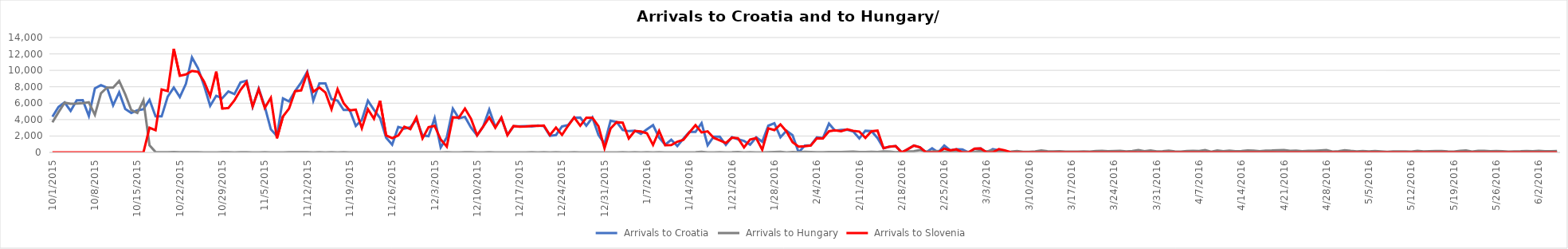
| Category | Arrivals to Croatia | Arrivals to Hungary | Arrivals to Slovenia |
|---|---|---|---|
| 10/1/15 | 4344 | 3667 | 0 |
| 10/2/15 | 5546 | 4897 | 0 |
| 10/3/15 | 6086 | 6056 | 0 |
| 10/4/15 | 5065 | 5925 | 0 |
| 10/5/15 | 6338 | 5952 | 0 |
| 10/6/15 | 6370 | 6000 | 0 |
| 10/7/15 | 4446 | 6103 | 0 |
| 10/8/15 | 7798 | 4583 | 6 |
| 10/9/15 | 8201 | 7215 | 0 |
| 10/10/15 | 7896 | 7907 | 0 |
| 10/11/15 | 5732 | 7897 | 0 |
| 10/12/15 | 7317 | 8702 | 0 |
| 10/13/15 | 5286 | 7081 | 0 |
| 10/14/15 | 4814 | 5157 | 0 |
| 10/15/15 | 5138 | 4808 | 0 |
| 10/16/15 | 5260 | 6353 | 0 |
| 10/17/15 | 6415 | 870 | 3000 |
| 10/18/15 | 4390 | 41 | 2700 |
| 10/19/15 | 4388 | 22 | 7677 |
| 10/20/15 | 6793 | 36 | 7478 |
| 10/21/15 | 7900 | 39 | 12616 |
| 10/22/15 | 6748 | 32 | 9339 |
| 10/23/15 | 8348 | 29 | 9500 |
| 10/24/15 | 11570 | 35 | 9925 |
| 10/25/15 | 10249 | 34 | 9818 |
| 10/26/15 | 8128 | 12 | 8625 |
| 10/27/15 | 5683 | 7 | 6877 |
| 10/28/15 | 6900 | 4 | 9848 |
| 10/29/15 | 6615 | 23 | 5341 |
| 10/30/15 | 7429 | 18 | 5409 |
| 10/31/15 | 7110 | 10 | 6344 |
| 11/1/15 | 8534 | 14 | 7611 |
| 11/2/15 | 8746 | 31 | 8568 |
| 11/3/15 | 5573 | 8 | 5591 |
| 11/4/15 | 7792 | 10 | 7693 |
| 11/5/15 | 5587 | 18 | 5426 |
| 11/6/15 | 2809 | 4 | 6655 |
| 11/7/15 | 2000 | 8 | 1716 |
| 11/8/15 | 6579 | 9 | 4381 |
| 11/9/15 | 6214 | 25 | 5341 |
| 11/10/15 | 7474 | 14 | 7457 |
| 11/11/15 | 8524 | 13 | 7554 |
| 11/12/15 | 9823 | 23 | 9681 |
| 11/13/15 | 6314 | 6 | 7397 |
| 11/14/15 | 8405 | 21 | 7905 |
| 11/15/15 | 8415 | 8 | 7300 |
| 11/16/15 | 6490 | 15 | 5261 |
| 11/17/15 | 6304 | 5 | 7704 |
| 11/18/15 | 5180 | 15 | 5998 |
| 11/19/15 | 5167 | 4 | 5119 |
| 11/20/15 | 3230 | 9 | 5211 |
| 11/21/15 | 3977 | 2 | 2952 |
| 11/22/15 | 6305 | 11 | 5260 |
| 11/23/15 | 5184 | 4 | 4102 |
| 11/24/15 | 4203 | 4 | 6297 |
| 11/25/15 | 1808 | 6 | 2070 |
| 11/26/15 | 952 | 10 | 1742 |
| 11/27/15 | 3095 | 2 | 2065 |
| 11/28/15 | 2886 | 6 | 3139 |
| 11/29/15 | 3060 | 3 | 2843 |
| 11/30/15 | 4009 | 7 | 4274 |
| 12/1/15 | 2066 | 4 | 1709 |
| 12/2/15 | 1982 | 4 | 3077 |
| 12/3/15 | 4174 | 9 | 3237 |
| 12/4/15 | 611 | 1 | 1577 |
| 12/5/15 | 1835 | 31 | 715 |
| 12/6/15 | 5339 | 7 | 4288 |
| 12/7/15 | 4162 | 0 | 4240 |
| 12/8/15 | 4335 | 13 | 5351 |
| 12/9/15 | 3027 | 14 | 4103 |
| 12/10/15 | 2076 | 3 | 2078 |
| 12/11/15 | 3149 | 0 | 3149 |
| 12/12/15 | 5225 | 13 | 4271 |
| 12/13/15 | 3112 | 10 | 3016 |
| 12/14/15 | 4174 | 3 | 4250 |
| 12/15/15 | 2160 | 2 | 2098 |
| 12/16/15 | 3177 | 6 | 3214 |
| 12/17/15 | 3192 | 0 | 3135 |
| 12/18/15 | 3200 | 11 | 3150 |
| 12/19/15 | 3156 | 31 | 3222 |
| 12/20/15 | 3276 | 8 | 3233 |
| 12/21/15 | 3210 | 25 | 3278 |
| 12/22/15 | 2027 | 1 | 2118 |
| 12/23/15 | 2116 | 21 | 3030 |
| 12/24/15 | 3166 | 8 | 2131 |
| 12/25/15 | 3339 | 2 | 3257 |
| 12/26/15 | 4241 | 17 | 4274 |
| 12/27/15 | 4251 | 10 | 3253 |
| 12/28/15 | 3249 | 0 | 4228 |
| 12/29/15 | 4253 | 0 | 4239 |
| 12/30/15 | 2132 | 11 | 3195 |
| 12/31/15 | 1058 | 5 | 511 |
| 1/1/16 | 3869 | 0 | 2914 |
| 1/2/16 | 3710 | 0 | 3690 |
| 1/3/16 | 2732 | 17 | 3619 |
| 1/4/16 | 2591 | 3 | 1708 |
| 1/5/16 | 2650 | 18 | 2626 |
| 1/6/16 | 2273 | 5 | 2550 |
| 1/7/16 | 2814 | 31 | 2337 |
| 1/8/16 | 3332 | 7 | 916 |
| 1/9/16 | 1799 | 15 | 2630 |
| 1/10/16 | 942 | 6 | 880 |
| 1/11/16 | 1549 | 7 | 897 |
| 1/12/16 | 769 | 2 | 1308 |
| 1/13/16 | 1679 | 5 | 1544 |
| 1/14/16 | 2502 | 4 | 2449 |
| 1/15/16 | 2493 | 14 | 3330 |
| 1/16/16 | 3579 | 65 | 2435 |
| 1/17/16 | 878 | 11 | 2570 |
| 1/18/16 | 1930 | 9 | 1783 |
| 1/19/16 | 1917 | 29 | 1476 |
| 1/20/16 | 914 | 10 | 1154 |
| 1/21/16 | 1865 | 13 | 1787 |
| 1/22/16 | 1599 | 47 | 1738 |
| 1/23/16 | 1394 | 10 | 606 |
| 1/24/16 | 946 | 15 | 1564 |
| 1/25/16 | 1847 | 5 | 1746 |
| 1/26/16 | 1309 | 4 | 326 |
| 1/27/16 | 3256 | 36 | 2935 |
| 1/28/16 | 3565 | 51 | 2719 |
| 1/29/16 | 1843 | 69 | 3416 |
| 1/30/16 | 2641 | 6 | 2556 |
| 1/31/16 | 2098 | 39 | 1249 |
| 2/1/16 | 0 | 31 | 716 |
| 2/2/16 | 822 | 69 | 765 |
| 2/3/16 | 881 | 46 | 841 |
| 2/4/16 | 1836 | 31 | 1733 |
| 2/5/16 | 1750 | 19 | 1713 |
| 2/6/16 | 3510 | 49 | 2580 |
| 2/7/16 | 2658 | 53 | 2694 |
| 2/8/16 | 2736 | 48 | 2582 |
| 2/9/16 | 2764 | 72 | 2805 |
| 2/10/16 | 2544 | 104 | 2637 |
| 2/11/16 | 1716 | 54 | 2547 |
| 2/12/16 | 2635 | 39 | 1774 |
| 2/13/16 | 2595 | 66 | 2576 |
| 2/14/16 | 1749 | 51 | 2660 |
| 2/15/16 | 512 | 119 | 516 |
| 2/16/16 | 701 | 93 | 715 |
| 2/17/16 | 769 | 34 | 769 |
| 2/18/16 | 0 | 73 | 0 |
| 2/19/16 | 408 | 113 | 407 |
| 2/20/16 | 834 | 151 | 828 |
| 2/21/16 | 630 | 288 | 623 |
| 2/22/16 | 0 | 103 | 0 |
| 2/23/16 | 507 | 112 | 0 |
| 2/24/16 | 0 | 166 | 0 |
| 2/25/16 | 841 | 76 | 478 |
| 2/26/16 | 250 | 140 | 254 |
| 2/27/16 | 385 | 111 | 382 |
| 2/28/16 | 358 | 62 | 0 |
| 2/29/16 | 0 | 78 | 0 |
| 3/1/16 | 436 | 83 | 466 |
| 3/2/16 | 476 | 181 | 479 |
| 3/3/16 | 0 | 133 | 0 |
| 3/4/16 | 410 | 268 | 0 |
| 3/5/16 | 253 | 89 | 409 |
| 3/6/16 | 0 | 72 | 253 |
| 3/7/16 | 0 | 100 | 0 |
| 3/8/16 | 0 | 167 | 0 |
| 3/9/16 | 0 | 73 | 0 |
| 3/10/16 | 0 | 70 | 0 |
| 3/11/16 | 0 | 133 | 0 |
| 3/12/16 | 0 | 245 | 0 |
| 3/13/16 | 0 | 148 | 0 |
| 3/14/16 | 0 | 123 | 0 |
| 3/15/16 | 0 | 153 | 0 |
| 3/16/16 | 0 | 104 | 0 |
| 3/17/16 | 0 | 102 | 0 |
| 3/18/16 | 0 | 95 | 0 |
| 3/19/16 | 0 | 132 | 0 |
| 3/20/16 | 0 | 107 | 0 |
| 3/21/16 | 0 | 176 | 0 |
| 3/22/16 | 0 | 188 | 0 |
| 3/23/16 | 0 | 137 | 0 |
| 3/24/16 | 0 | 171 | 0 |
| 3/25/16 | 0 | 199 | 0 |
| 3/26/16 | 0 | 125 | 0 |
| 3/27/16 | 0 | 171 | 6 |
| 3/28/16 | 0 | 293 | 0 |
| 3/29/16 | 0 | 154 | 5 |
| 3/30/16 | 0 | 234 | 4 |
| 3/31/16 | 0 | 127 | 0 |
| 4/1/16 | 0 | 142 | 0 |
| 4/2/16 | 0 | 217 | 0 |
| 4/3/16 | 0 | 119 | 0 |
| 4/4/16 | 0 | 99 | 0 |
| 4/5/16 | 0 | 176 | 2 |
| 4/6/16 | 0 | 191 | 0 |
| 4/7/16 | 0 | 178 | 0 |
| 4/8/16 | 0 | 280 | 0 |
| 4/9/16 | 0 | 83 | 0 |
| 4/10/16 | 0 | 230 | 0 |
| 4/11/16 | 0 | 149 | 0 |
| 4/12/16 | 0 | 214 | 0 |
| 4/13/16 | 0 | 150 | 0 |
| 4/14/16 | 0 | 161 | 0 |
| 4/15/16 | 0 | 237 | 0 |
| 4/16/16 | 0 | 210 | 0 |
| 4/17/16 | 0 | 144 | 0 |
| 4/18/16 | 0 | 229 | 0 |
| 4/19/16 | 0 | 235 | 0 |
| 4/20/16 | 0 | 274 | 0 |
| 4/21/16 | 0 | 294 | 0 |
| 4/22/16 | 0 | 195 | 0 |
| 4/23/16 | 0 | 226 | 0 |
| 4/24/16 | 0 | 151 | 0 |
| 4/25/16 | 0 | 202 | 0 |
| 4/26/16 | 0 | 190 | 0 |
| 4/27/16 | 0 | 241 | 0 |
| 4/28/16 | 0 | 284 | 0 |
| 4/29/16 | 0 | 108 | 0 |
| 4/30/16 | 0 | 141 | 0 |
| 5/1/16 | 0 | 274 | 0 |
| 5/2/16 | 0 | 187 | 0 |
| 5/3/16 | 0 | 131 | 0 |
| 5/4/16 | 0 | 169 | 0 |
| 5/5/16 | 0 | 133 | 0 |
| 5/6/16 | 0 | 178 | 0 |
| 5/7/16 | 0 | 132 | 0 |
| 5/8/16 | 0 | 75 | 0 |
| 5/9/16 | 0 | 124 | 0 |
| 5/10/16 | 0 | 128 | 0 |
| 5/11/16 | 0 | 120 | 0 |
| 5/12/16 | 0 | 89 | 0 |
| 5/13/16 | 0 | 201 | 0 |
| 5/14/16 | 0 | 120 | 0 |
| 5/15/16 | 0 | 139 | 0 |
| 5/16/16 | 0 | 169 | 0 |
| 5/17/16 | 0 | 164 | 0 |
| 5/18/16 | 0 | 121 | 0 |
| 5/19/16 | 0 | 100 | 0 |
| 5/20/16 | 0 | 198 | 0 |
| 5/21/16 | 0 | 245 | 0 |
| 5/22/16 | 0 | 108 | 0 |
| 5/23/16 | 0 | 193 | 0 |
| 5/24/16 | 0 | 198 | 0 |
| 5/25/16 | 0 | 139 | 0 |
| 5/26/16 | 0 | 181 | 0 |
| 5/27/16 | 0 | 144 | 0 |
| 5/28/16 | 0 | 92 | 0 |
| 5/29/16 | 0 | 115 | 0 |
| 5/30/16 | 0 | 140 | 0 |
| 5/31/16 | 0 | 182 | 0 |
| 6/1/16 | 0 | 138 | 0 |
| 6/2/16 | 0 | 187 | 0 |
| 6/3/16 | 0 | 146 | 0 |
| 6/4/16 | 0 | 135 | 0 |
| 6/5/16 | 0 | 164 | 0 |